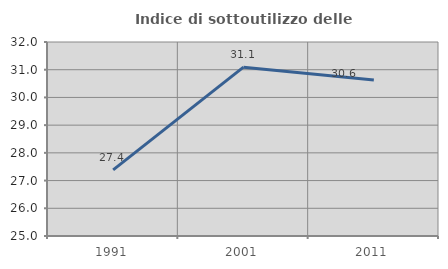
| Category | Indice di sottoutilizzo delle abitazioni  |
|---|---|
| 1991.0 | 27.386 |
| 2001.0 | 31.093 |
| 2011.0 | 30.625 |